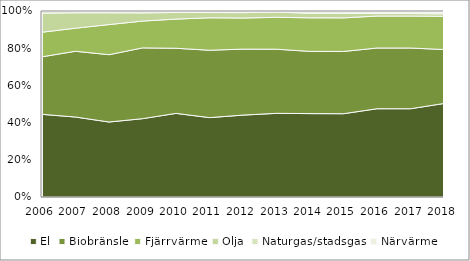
| Category | El | Biobränsle | Fjärrvärme | Olja | Naturgas/stadsgas | Närvärme |
|---|---|---|---|---|---|---|
| 2006 | 0.447 | 0.311 | 0.133 | 0.103 | 0.009 | 0.003 |
| 2007 | 0.43 | 0.354 | 0.124 | 0.083 | 0.006 | 0.003 |
| 2008 | 0.403 | 0.362 | 0.162 | 0.063 | 0.006 | 0.003 |
| 2009 | 0.421 | 0.381 | 0.144 | 0.044 | 0.006 | 0.004 |
| 2010 | 0.45 | 0.35 | 0.157 | 0.036 | 0.006 | 0.002 |
| 2011 | 0.427 | 0.362 | 0.174 | 0.028 | 0.004 | 0.005 |
| 2012 | 0.44 | 0.355 | 0.167 | 0.029 | 0.005 | 0.004 |
| 2013 | 0.45 | 0.345 | 0.172 | 0.028 | 0.003 | 0.003 |
| 2014 | 0.448 | 0.335 | 0.18 | 0.024 | 0.008 | 0.005 |
| 2015 | 0.448 | 0.335 | 0.181 | 0.024 | 0.008 | 0.005 |
| 2016 | 0.475 | 0.326 | 0.172 | 0.013 | 0.008 | 0.006 |
| 2017 | 0.475 | 0.326 | 0.172 | 0.013 | 0.008 | 0.006 |
| 2018 | 0.503 | 0.29 | 0.179 | 0.013 | 0.009 | 0.007 |